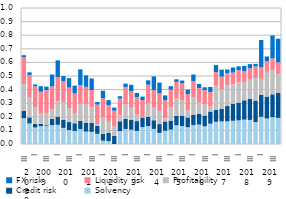
| Category | Solvency | Credit risk | Profitability | Liquidity risk | FX risk |
|---|---|---|---|---|---|
| 0 | 0.19 | 0.054 | 0.195 | 0.2 | 0.014 |
| 1 | 0.151 | 0.045 | 0.145 | 0.168 | 0.019 |
| 2 | 0.121 | 0.027 | 0.12 | 0.156 | 0.014 |
| 3 | 0.131 | 0.017 | 0.079 | 0.158 | 0.041 |
| 4 | 0.135 | 0.007 | 0.087 | 0.168 | 0.026 |
| 5 | 0.139 | 0.047 | 0.069 | 0.17 | 0.086 |
| 6 | 0.141 | 0.06 | 0.113 | 0.178 | 0.123 |
| 7 | 0.118 | 0.058 | 0.132 | 0.154 | 0.038 |
| 8 | 0.102 | 0.059 | 0.103 | 0.15 | 0.069 |
| 9 | 0.096 | 0.056 | 0.074 | 0.145 | 0.058 |
| 10 | 0.109 | 0.062 | 0.126 | 0.136 | 0.116 |
| 11 | 0.092 | 0.064 | 0.133 | 0.132 | 0.085 |
| 12 | 0.089 | 0.065 | 0.114 | 0.128 | 0.085 |
| 13 | 0.075 | 0.059 | 0.013 | 0.142 | 0.019 |
| 14 | 0.024 | 0.05 | 0.125 | 0.137 | 0.055 |
| 15 | 0.022 | 0.06 | 0.081 | 0.123 | 0.036 |
| 16 | 0 | 0.059 | 0.07 | 0.116 | 0.023 |
| 17 | 0.096 | 0.071 | 0.045 | 0.122 | 0.017 |
| 18 | 0.111 | 0.075 | 0.105 | 0.128 | 0.025 |
| 19 | 0.105 | 0.074 | 0.088 | 0.121 | 0.047 |
| 20 | 0.096 | 0.072 | 0.048 | 0.128 | 0.03 |
| 21 | 0.125 | 0.067 | 0 | 0.131 | 0.026 |
| 22 | 0.132 | 0.068 | 0.102 | 0.135 | 0.032 |
| 23 | 0.111 | 0.064 | 0.093 | 0.128 | 0.102 |
| 24 | 0.082 | 0.065 | 0.094 | 0.132 | 0.079 |
| 25 | 0.098 | 0.068 | 0.022 | 0.135 | 0.035 |
| 26 | 0.106 | 0.066 | 0.099 | 0.129 | 0.025 |
| 27 | 0.138 | 0.069 | 0.127 | 0.123 | 0.019 |
| 28 | 0.133 | 0.073 | 0.115 | 0.126 | 0.02 |
| 29 | 0.123 | 0.071 | 0.052 | 0.12 | 0.032 |
| 30 | 0.139 | 0.077 | 0.13 | 0.118 | 0.048 |
| 31 | 0.143 | 0.078 | 0.084 | 0.107 | 0.03 |
| 32 | 0.131 | 0.079 | 0.085 | 0.103 | 0.02 |
| 33 | 0.149 | 0.09 | 0.036 | 0.106 | 0.039 |
| 34 | 0.163 | 0.088 | 0.178 | 0.1 | 0.051 |
| 35 | 0.166 | 0.094 | 0.143 | 0.093 | 0.051 |
| 36 | 0.167 | 0.112 | 0.151 | 0.091 | 0.027 |
| 37 | 0.171 | 0.125 | 0.145 | 0.085 | 0.038 |
| 38 | 0.174 | 0.13 | 0.149 | 0.09 | 0.028 |
| 39 | 0.179 | 0.142 | 0.135 | 0.078 | 0.039 |
| 40 | 0.177 | 0.154 | 0.143 | 0.083 | 0.031 |
| 41 | 0.161 | 0.159 | 0.165 | 0.086 | 0.019 |
| 42 | 0.2 | 0.162 | 0.112 | 0.091 | 0.2 |
| 43 | 0.188 | 0.161 | 0.182 | 0.078 | 0.035 |
| 44 | 0.197 | 0.168 | 0.178 | 0.086 | 0.169 |
| 45 | 0.192 | 0.184 | 0.138 | 0.087 | 0.173 |